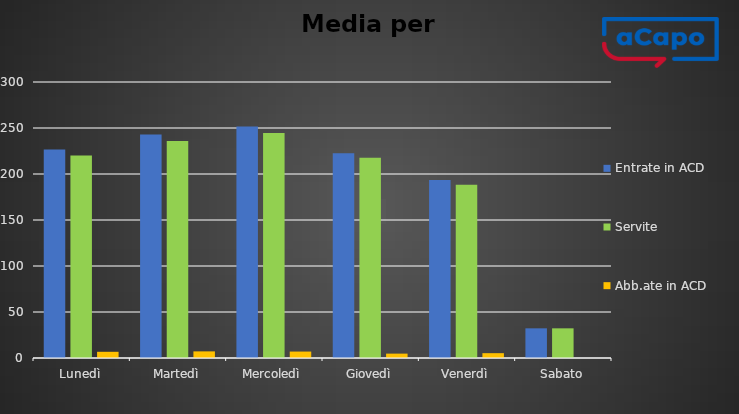
| Category | Entrate in ACD | Servite | Abb.ate in ACD |
|---|---|---|---|
| Lunedì | 226.75 | 220 | 6.75 |
| Martedì | 243 | 235.8 | 7.2 |
| Mercoledì | 251.5 | 244.5 | 7 |
| Giovedì | 222.5 | 217.75 | 4.75 |
| Venerdì | 193.5 | 188.25 | 5.25 |
| Sabato | 32.25 | 32.25 | 0 |